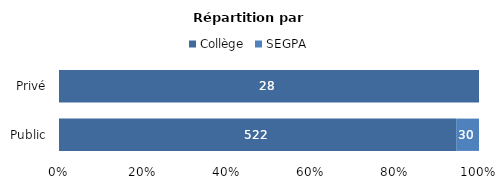
| Category | Collège | SEGPA |
|---|---|---|
| Public | 522 | 30 |
| Privé | 28 | 0 |